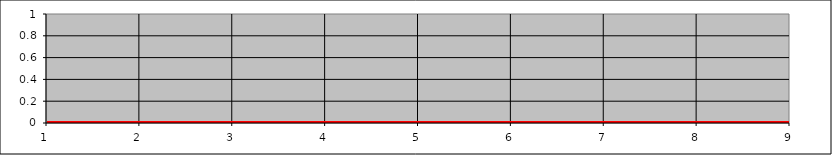
| Category | Series 4 | Series 5 | Series 6 | Series 0 |
|---|---|---|---|---|
| 0 | 0 | 0 | 0 |  |
| 1 | 0 | 0 | 0 |  |
| 2 | 0 | 0 | 0 |  |
| 3 | 0 | 0 | 0 |  |
| 4 | 0 | 0 | 0 |  |
| 5 | 0 | 0 | 0 |  |
| 6 | 0 | 0 | 0 |  |
| 7 | 0 | 0 | 0 |  |
| 8 | 0 | 0 | 0 |  |